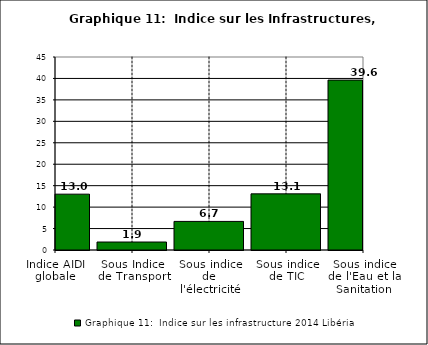
| Category | Graphique 11:  Indice sur les infrastructure 2014 |
|---|---|
| Indice AIDI globale | 13.019 |
| Sous Indice de Transport | 1.859 |
| Sous indice de l'électricité | 6.667 |
| Sous indice de TIC | 13.092 |
| Sous indice de l'Eau et la Sanitation | 39.617 |